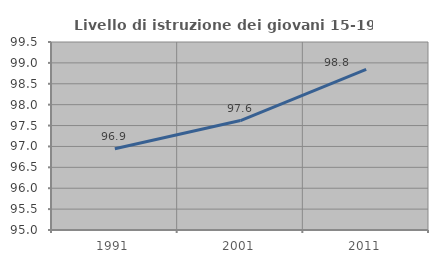
| Category | Livello di istruzione dei giovani 15-19 anni |
|---|---|
| 1991.0 | 96.947 |
| 2001.0 | 97.619 |
| 2011.0 | 98.846 |